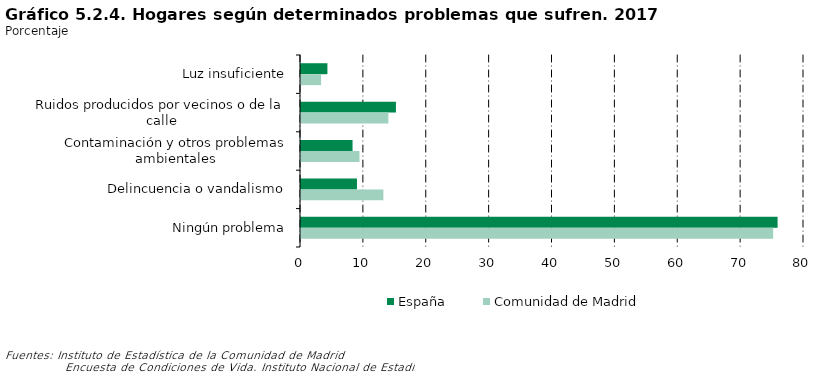
| Category | España | Comunidad de Madrid |
|---|---|---|
| Luz insuficiente | 4.2 | 3.2 |
| Ruidos producidos por vecinos o de la calle | 15.1 | 13.9 |
| Contaminación y otros problemas ambientales | 8.2 | 9.3 |
| Delincuencia o vandalismo | 8.9 | 13.1 |
| Ningún problema | 75.8 | 75.1 |